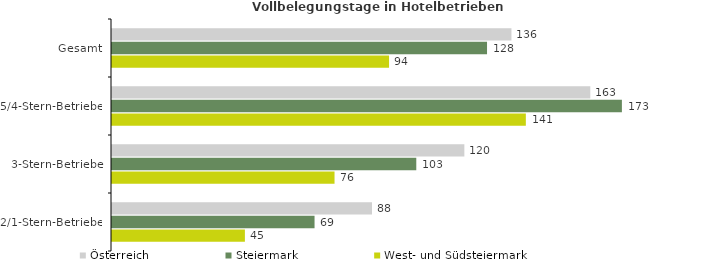
| Category | Österreich | Steiermark | West- und Südsteiermark |
|---|---|---|---|
| Gesamt | 135.866 | 127.561 | 94.236 |
| 5/4-Stern-Betriebe | 162.683 | 173.435 | 140.764 |
| 3-Stern-Betriebe | 119.851 | 103.499 | 75.69 |
| 2/1-Stern-Betriebe | 88.435 | 68.894 | 45.203 |